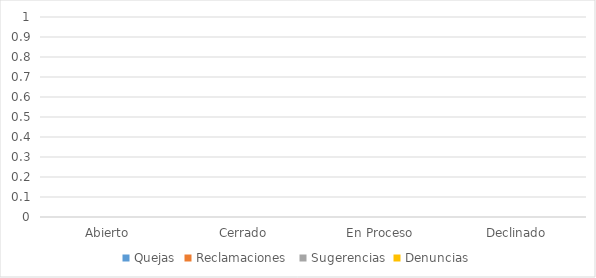
| Category | Quejas | Reclamaciones  | Sugerencias | Denuncias |
|---|---|---|---|---|
| Abierto | 0 | 0 | 0 | 0 |
| Cerrado | 0 | 0 | 0 | 0 |
| En Proceso | 0 | 0 | 0 | 0 |
| Declinado | 0 | 0 | 0 | 0 |